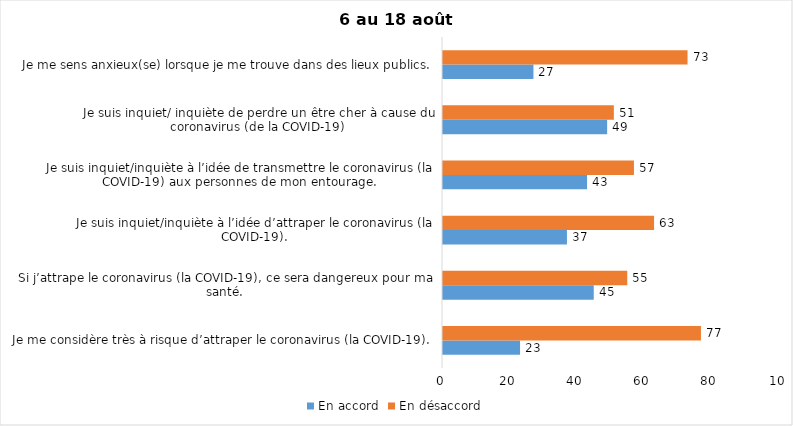
| Category | En accord | En désaccord |
|---|---|---|
| Je me considère très à risque d’attraper le coronavirus (la COVID-19). | 23 | 77 |
| Si j’attrape le coronavirus (la COVID-19), ce sera dangereux pour ma santé. | 45 | 55 |
| Je suis inquiet/inquiète à l’idée d’attraper le coronavirus (la COVID-19). | 37 | 63 |
| Je suis inquiet/inquiète à l’idée de transmettre le coronavirus (la COVID-19) aux personnes de mon entourage. | 43 | 57 |
| Je suis inquiet/ inquiète de perdre un être cher à cause du coronavirus (de la COVID-19) | 49 | 51 |
| Je me sens anxieux(se) lorsque je me trouve dans des lieux publics. | 27 | 73 |